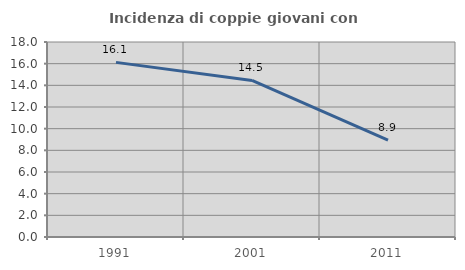
| Category | Incidenza di coppie giovani con figli |
|---|---|
| 1991.0 | 16.119 |
| 2001.0 | 14.452 |
| 2011.0 | 8.941 |